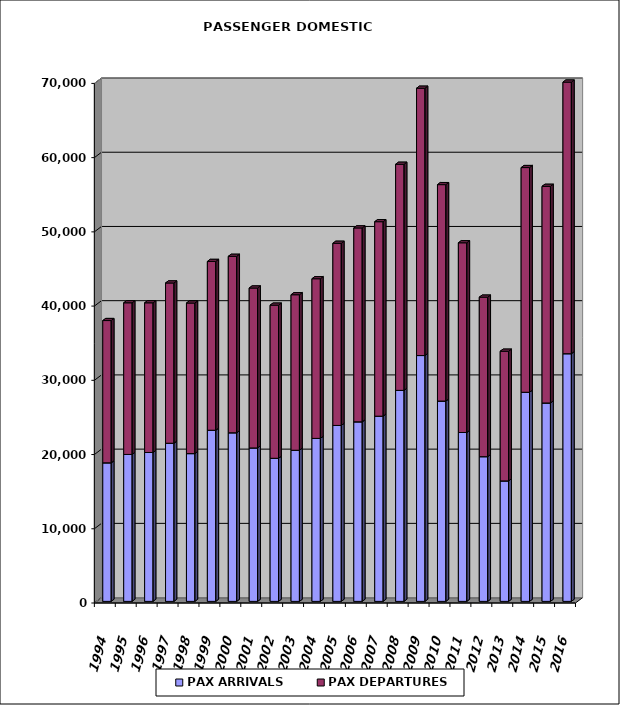
| Category | PAX ARRIVALS | PAX DEPARTURES |
|---|---|---|
| 1994.0 | 18667 | 19165 |
| 1995.0 | 19795 | 20432 |
| 1996.0 | 20057 | 20167 |
| 1997.0 | 21307 | 21588 |
| 1998.0 | 19908 | 20284 |
| 1999.0 | 23057 | 22738 |
| 2000.0 | 22714 | 23770 |
| 2001.0 | 20674 | 21541 |
| 2002.0 | 19276 | 20630 |
| 2003.0 | 20362 | 20948 |
| 2004.0 | 21956 | 21510 |
| 2005.0 | 23702 | 24539 |
| 2006.0 | 24191 | 26120 |
| 2007.0 | 24950 | 26202 |
| 2008.0 | 28427 | 30457 |
| 2009.0 | 33120 | 36010 |
| 2010.0 | 26989 | 29155 |
| 2011.0 | 22753 | 25556 |
| 2012.0 | 19496 | 21488 |
| 2013.0 | 16231 | 17468 |
| 2014.0 | 28172 | 30271 |
| 2015.0 | 26728 | 29187 |
| 2016.0 | 33369 | 36587 |